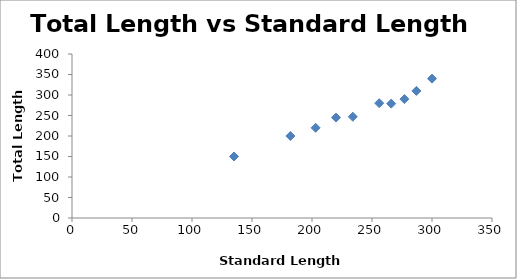
| Category | Total Length vs Standard Length |
|---|---|
| 135.0 | 150 |
| 182.0 | 200 |
| 203.0 | 220 |
| 220.0 | 245 |
| 234.0 | 247 |
| 256.0 | 280 |
| 266.0 | 279 |
| 277.0 | 290 |
| 287.0 | 310 |
| 300.0 | 340 |